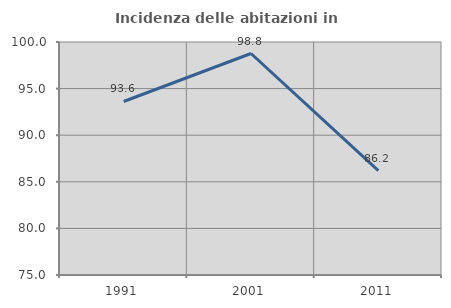
| Category | Incidenza delle abitazioni in proprietà  |
|---|---|
| 1991.0 | 93.617 |
| 2001.0 | 98.765 |
| 2011.0 | 86.207 |